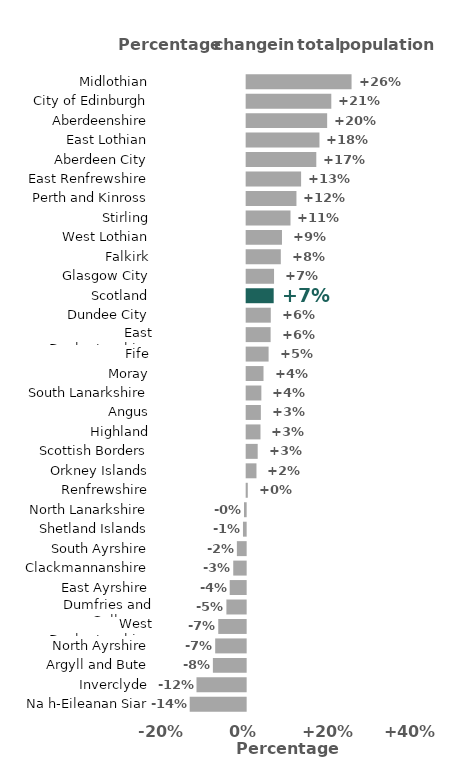
| Category | Series 0 |
|---|---|
| Na h-Eileanan Siar | -13.706 |
| Inverclyde | -12.04 |
| Argyll and Bute | -8.027 |
| North Ayrshire | -7.463 |
| West Dunbartonshire | -6.711 |
| Dumfries and Galloway | -4.72 |
| East Ayrshire | -3.906 |
| Clackmannanshire | -3.042 |
| South Ayrshire | -2.156 |
| Shetland Islands | -0.663 |
| North Lanarkshire | -0.412 |
| Renfrewshire | 0.275 |
| Orkney Islands | 2.4 |
| Scottish Borders | 2.701 |
| Highland | 3.386 |
| Angus | 3.477 |
| South Lanarkshire | 3.596 |
| Moray | 4.126 |
| Fife | 5.368 |
| East Dunbartonshire | 5.864 |
| Dundee City | 5.905 |
| Scotland | 6.617 |
| Glasgow City | 6.705 |
| Falkirk | 8.358 |
| West Lothian | 8.647 |
| Stirling | 10.733 |
| Perth and Kinross | 12.192 |
| East Renfrewshire | 13.329 |
| Aberdeen City | 17.055 |
| East Lothian | 17.825 |
| Aberdeenshire | 19.713 |
| City of Edinburgh | 20.727 |
| Midlothian | 25.689 |